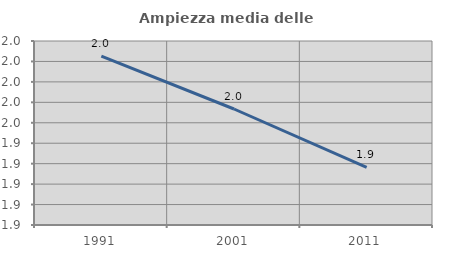
| Category | Ampiezza media delle famiglie |
|---|---|
| 1991.0 | 2.015 |
| 2001.0 | 1.963 |
| 2011.0 | 1.906 |